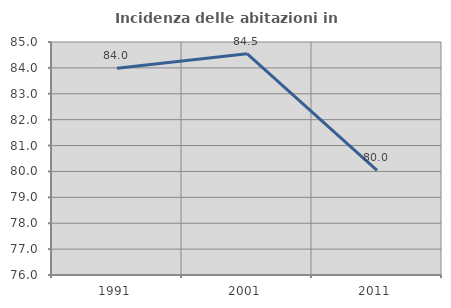
| Category | Incidenza delle abitazioni in proprietà  |
|---|---|
| 1991.0 | 83.986 |
| 2001.0 | 84.547 |
| 2011.0 | 80.039 |